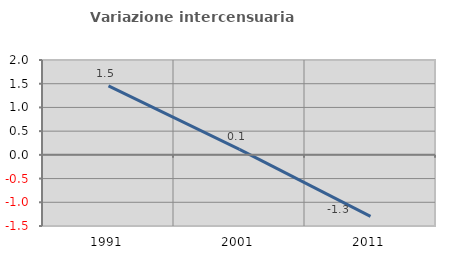
| Category | Variazione intercensuaria annua |
|---|---|
| 1991.0 | 1.454 |
| 2001.0 | 0.116 |
| 2011.0 | -1.296 |